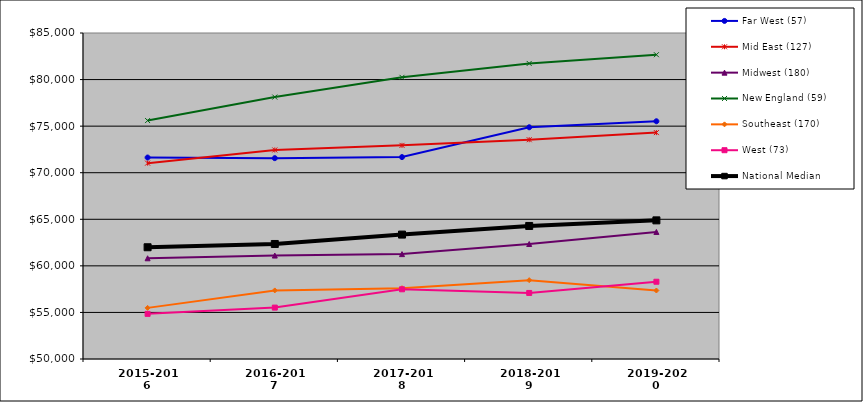
| Category | Far West (57) | Mid East (127) | Midwest (180) | New England (59) | Southeast (170) | West (73) | National Median |
|---|---|---|---|---|---|---|---|
| 2015-2016 | 71631 | 71028 | 60813 | 75600 | 55489.5 | 54846 | 61996.5 |
| 2016-2017 | 71563 | 72442 | 61105.5 | 78121 | 57364 | 55518 | 62349 |
| 2017-2018 | 71678 | 72936 | 61261 | 80240 | 57597.5 | 57485 | 63357 |
| 2018-2019 | 74879 | 73543 | 62345 | 81732 | 58463.5 | 57092 | 64282.5 |
| 2019-2020 | 75523 | 74305 | 63639 | 82669 | 57353 | 58294 | 64884.5 |